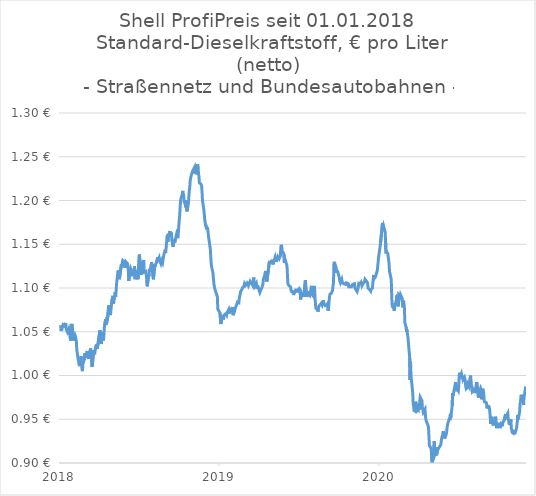
| Category | Diesel |
|---|---|
| 2020-12-12 | 0.99 |
| 2020-12-11 | 0.989 |
| 2020-12-10 | 0.991 |
| 2020-12-09 | 0.991 |
| 2020-12-08 | 0.985 |
| 2020-12-05 | 0.977 |
| 2020-12-04 | 0.978 |
| 2020-12-03 | 0.979 |
| 2020-12-02 | 0.986 |
| 2020-12-01 | 0.988 |
| 2020-11-28 | 0.978 |
| 2020-11-27 | 0.975 |
| 2020-11-26 | 0.966 |
| 2020-11-25 | 0.973 |
| 2020-11-24 | 0.971 |
| 2020-11-21 | 0.978 |
| 2020-11-20 | 0.976 |
| 2020-11-19 | 0.97 |
| 2020-11-18 | 0.968 |
| 2020-11-17 | 0.959 |
| 2020-11-14 | 0.95 |
| 2020-11-13 | 0.955 |
| 2020-11-12 | 0.949 |
| 2020-11-11 | 0.945 |
| 2020-11-10 | 0.94 |
| 2020-11-07 | 0.935 |
| 2020-11-06 | 0.935 |
| 2020-11-05 | 0.935 |
| 2020-11-04 | 0.936 |
| 2020-11-03 | 0.934 |
| 2020-10-31 | 0.935 |
| 2020-10-30 | 0.938 |
| 2020-10-29 | 0.94 |
| 2020-10-28 | 0.95 |
| 2020-10-27 | 0.944 |
| 2020-10-24 | 0.945 |
| 2020-10-23 | 0.948 |
| 2020-10-22 | 0.95 |
| 2020-10-21 | 0.957 |
| 2020-10-20 | 0.958 |
| 2020-10-17 | 0.953 |
| 2020-10-16 | 0.956 |
| 2020-10-15 | 0.955 |
| 2020-10-14 | 0.956 |
| 2020-10-13 | 0.95 |
| 2020-10-10 | 0.946 |
| 2020-10-09 | 0.946 |
| 2020-10-08 | 0.942 |
| 2020-10-07 | 0.947 |
| 2020-10-06 | 0.946 |
| 2020-10-03 | 0.94 |
| 2020-10-02 | 0.945 |
| 2020-10-01 | 0.943 |
| 2020-09-30 | 0.946 |
| 2020-09-29 | 0.945 |
| 2020-09-26 | 0.94 |
| 2020-09-25 | 0.943 |
| 2020-09-24 | 0.95 |
| 2020-09-23 | 0.953 |
| 2020-09-22 | 0.948 |
| 2020-09-19 | 0.945 |
| 2020-09-18 | 0.943 |
| 2020-09-17 | 0.943 |
| 2020-09-16 | 0.948 |
| 2020-09-15 | 0.953 |
| 2020-09-12 | 0.945 |
| 2020-09-11 | 0.953 |
| 2020-09-10 | 0.958 |
| 2020-09-09 | 0.963 |
| 2020-09-08 | 0.964 |
| 2020-09-05 | 0.965 |
| 2020-09-04 | 0.962 |
| 2020-09-03 | 0.966 |
| 2020-09-02 | 0.969 |
| 2020-09-01 | 0.969 |
| 2020-08-29 | 0.97 |
| 2020-08-28 | 0.971 |
| 2020-08-27 | 0.98 |
| 2020-08-26 | 0.982 |
| 2020-08-25 | 0.985 |
| 2020-08-22 | 0.973 |
| 2020-08-21 | 0.984 |
| 2020-08-20 | 0.985 |
| 2020-08-19 | 0.984 |
| 2020-08-18 | 0.982 |
| 2020-08-15 | 0.975 |
| 2020-08-14 | 0.98 |
| 2020-08-13 | 0.986 |
| 2020-08-12 | 0.991 |
| 2020-08-11 | 0.992 |
| 2020-08-08 | 0.981 |
| 2020-08-07 | 0.98 |
| 2020-08-06 | 0.986 |
| 2020-08-05 | 0.985 |
| 2020-08-04 | 0.983 |
| 2020-08-01 | 0.981 |
| 2020-07-31 | 0.987 |
| 2020-07-30 | 0.988 |
| 2020-07-29 | 0.994 |
| 2020-07-28 | 1 |
| 2020-07-25 | 0.987 |
| 2020-07-24 | 0.988 |
| 2020-07-23 | 0.987 |
| 2020-07-22 | 0.99 |
| 2020-07-21 | 0.987 |
| 2020-07-21 | 0.987 |
| 2020-07-18 | 0.985 |
| 2020-07-17 | 0.987 |
| 2020-07-16 | 0.993 |
| 2020-07-15 | 0.996 |
| 2020-07-14 | 0.998 |
| 2020-07-11 | 0.995 |
| 2020-07-10 | 1 |
| 2020-07-09 | 0.998 |
| 2020-07-08 | 1 |
| 2020-07-07 | 1.002 |
| 2020-07-04 | 0.999 |
| 2020-07-03 | 1.003 |
| 2020-07-02 | 0.999 |
| 2020-07-01 | 0.988 |
| 2020-06-30 | 0.982 |
| 2020-06-27 | 0.985 |
| 2020-06-26 | 0.982 |
| 2020-06-25 | 0.989 |
| 2020-06-24 | 0.992 |
| 2020-06-23 | 0.99 |
| 2020-06-20 | 0.982 |
| 2020-06-19 | 0.982 |
| 2020-06-18 | 0.976 |
| 2020-06-17 | 0.98 |
| 2020-06-16 | 0.966 |
| 2020-06-13 | 0.952 |
| 2020-06-12 | 0.956 |
| 2020-06-11 | 0.949 |
| 2020-06-10 | 0.952 |
| 2020-06-09 | 0.95 |
| 2020-06-06 | 0.945 |
| 2020-06-05 | 0.942 |
| 2020-06-04 | 0.939 |
| 2020-06-03 | 0.934 |
| 2020-05-30 | 0.928 |
| 2020-05-29 | 0.931 |
| 2020-05-28 | 0.934 |
| 2020-05-27 | 0.936 |
| 2020-05-26 | 0.934 |
| 2020-05-23 | 0.928 |
| 2020-05-21 | 0.921 |
| 2020-05-20 | 0.92 |
| 2020-05-19 | 0.92 |
| 2020-05-16 | 0.917 |
| 2020-05-15 | 0.915 |
| 2020-05-14 | 0.918 |
| 2020-05-13 | 0.917 |
| 2020-05-12 | 0.91 |
| 2020-05-09 | 0.909 |
| 2020-05-08 | 0.912 |
| 2020-05-07 | 0.917 |
| 2020-05-06 | 0.925 |
| 2020-05-05 | 0.906 |
| 2020-05-01 | 0.9 |
| 2020-04-30 | 0.91 |
| 2020-04-29 | 0.916 |
| 2020-04-28 | 0.918 |
| 2020-04-25 | 0.92 |
| 2020-04-24 | 0.93 |
| 2020-04-23 | 0.94 |
| 2020-04-22 | 0.942 |
| 2020-04-21 | 0.944 |
| 2020-04-18 | 0.948 |
| 2020-04-17 | 0.95 |
| 2020-04-16 | 0.954 |
| 2020-04-15 | 0.962 |
| 2020-04-11 | 0.958 |
| 2020-04-10 | 0.961 |
| 2020-04-09 | 0.963 |
| 2020-04-08 | 0.971 |
| 2020-04-07 | 0.972 |
| 2020-04-04 | 0.975 |
| 2020-04-03 | 0.971 |
| 2020-04-02 | 0.961 |
| 2020-04-01 | 0.968 |
| 2020-03-31 | 0.962 |
| 2020-03-28 | 0.965 |
| 2020-03-27 | 0.958 |
| 2020-03-26 | 0.963 |
| 2020-03-25 | 0.97 |
| 2020-03-24 | 0.959 |
| 2020-03-21 | 0.96 |
| 2020-03-20 | 0.965 |
| 2020-03-19 | 0.968 |
| 2020-03-18 | 0.98 |
| 2020-03-17 | 0.985 |
| 2020-03-14 | 1 |
| 2020-03-13 | 1.016 |
| 2020-03-12 | 0.995 |
| 2020-03-11 | 1.02 |
| 2020-03-10 | 1.02 |
| 2020-03-07 | 1.044 |
| 2020-03-06 | 1.046 |
| 2020-03-05 | 1.052 |
| 2020-03-04 | 1.05 |
| 2020-03-03 | 1.055 |
| 2020-02-29 | 1.06 |
| 2020-02-28 | 1.077 |
| 2020-02-27 | 1.082 |
| 2020-02-26 | 1.086 |
| 2020-02-25 | 1.078 |
| 2020-02-22 | 1.089 |
| 2020-02-21 | 1.09 |
| 2020-02-20 | 1.09 |
| 2020-02-19 | 1.092 |
| 2020-02-18 | 1.09 |
| 2020-02-15 | 1.092 |
| 2020-02-14 | 1.079 |
| 2020-02-13 | 1.092 |
| 2020-02-12 | 1.09 |
| 2020-02-11 | 1.092 |
| 2020-02-08 | 1.08 |
| 2020-02-07 | 1.083 |
| 2020-02-06 | 1.08 |
| 2020-02-05 | 1.074 |
| 2020-02-04 | 1.077 |
| 2020-02-01 | 1.078 |
| 2020-01-31 | 1.08 |
| 2020-01-30 | 1.09 |
| 2020-01-29 | 1.109 |
| 2020-01-28 | 1.112 |
| 2020-01-25 | 1.119 |
| 2020-01-24 | 1.127 |
| 2020-01-23 | 1.132 |
| 2020-01-22 | 1.136 |
| 2020-01-21 | 1.14 |
| 2020-01-18 | 1.141 |
| 2020-01-17 | 1.14 |
| 2020-01-16 | 1.153 |
| 2020-01-15 | 1.164 |
| 2020-01-14 | 1.162 |
| 2020-01-11 | 1.172 |
| 2020-01-10 | 1.17 |
| 2020-01-09 | 1.174 |
| 2020-01-08 | 1.175 |
| 2020-01-04 | 1.149 |
| 2020-01-03 | 1.15 |
| 2019-12-31 | 1.135 |
| 2019-12-28 | 1.12 |
| 2019-12-24 | 1.113 |
| 2019-12-21 | 1.111 |
| 2019-12-20 | 1.115 |
| 2019-12-19 | 1.11 |
| 2019-12-18 | 1.106 |
| 2019-12-17 | 1.1 |
| 2019-12-14 | 1.098 |
| 2019-12-13 | 1.096 |
| 2019-12-12 | 1.096 |
| 2019-12-11 | 1.098 |
| 2019-12-10 | 1.098 |
| 2019-12-07 | 1.1 |
| 2019-12-06 | 1.105 |
| 2019-12-05 | 1.105 |
| 2019-12-04 | 1.107 |
| 2019-12-03 | 1.108 |
| 2019-11-30 | 1.11 |
| 2019-11-29 | 1.107 |
| 2019-11-28 | 1.107 |
| 2019-11-27 | 1.107 |
| 2019-11-26 | 1.105 |
| 2019-11-23 | 1.102 |
| 2019-11-22 | 1.102 |
| 2019-11-21 | 1.106 |
| 2019-11-20 | 1.106 |
| 2019-11-19 | 1.105 |
| 2019-11-16 | 1.105 |
| 2019-11-15 | 1.106 |
| 2019-11-14 | 1.099 |
| 2019-11-13 | 1.1 |
| 2019-11-12 | 1.096 |
| 2019-11-09 | 1.098 |
| 2019-11-08 | 1.099 |
| 2019-11-07 | 1.1 |
| 2019-11-06 | 1.105 |
| 2019-11-05 | 1.105 |
| 2019-11-01 | 1.104 |
| 2019-10-31 | 1.105 |
| 2019-10-30 | 1.101 |
| 2019-10-29 | 1.102 |
| 2019-10-26 | 1.101 |
| 2019-10-25 | 1.1 |
| 2019-10-24 | 1.099 |
| 2019-10-23 | 1.105 |
| 2019-10-22 | 1.104 |
| 2019-10-19 | 1.106 |
| 2019-10-18 | 1.103 |
| 2019-10-17 | 1.105 |
| 2019-10-16 | 1.104 |
| 2019-10-15 | 1.104 |
| 2019-10-12 | 1.105 |
| 2019-10-11 | 1.104 |
| 2019-10-10 | 1.105 |
| 2019-10-09 | 1.107 |
| 2019-10-08 | 1.11 |
| 2019-10-05 | 1.106 |
| 2019-10-03 | 1.109 |
| 2019-10-02 | 1.113 |
| 2019-10-01 | 1.114 |
| 2019-09-28 | 1.12 |
| 2019-09-27 | 1.117 |
| 2019-09-26 | 1.12 |
| 2019-09-25 | 1.123 |
| 2019-09-24 | 1.125 |
| 2019-09-21 | 1.13 |
| 2019-09-20 | 1.124 |
| 2019-09-19 | 1.106 |
| 2019-09-18 | 1.103 |
| 2019-09-17 | 1.097 |
| 2019-09-14 | 1.094 |
| 2019-09-13 | 1.093 |
| 2019-09-12 | 1.093 |
| 2019-09-11 | 1.093 |
| 2019-09-10 | 1.09 |
| 2019-09-07 | 1.074 |
| 2019-09-06 | 1.082 |
| 2019-09-05 | 1.082 |
| 2019-09-04 | 1.081 |
| 2019-09-03 | 1.082 |
| 2019-08-31 | 1.08 |
| 2019-08-30 | 1.081 |
| 2019-08-29 | 1.081 |
| 2019-08-28 | 1.081 |
| 2019-08-27 | 1.086 |
| 2019-08-24 | 1.08 |
| 2019-08-23 | 1.08 |
| 2019-08-22 | 1.082 |
| 2019-08-21 | 1.082 |
| 2019-08-20 | 1.083 |
| 2019-08-17 | 1.079 |
| 2019-08-16 | 1.078 |
| 2019-08-15 | 1.073 |
| 2019-08-14 | 1.077 |
| 2019-08-13 | 1.076 |
| 2019-08-10 | 1.077 |
| 2019-08-09 | 1.081 |
| 2019-08-08 | 1.088 |
| 2019-08-07 | 1.099 |
| 2019-08-06 | 1.102 |
| 2019-08-03 | 1.091 |
| 2019-08-02 | 1.091 |
| 2019-08-01 | 1.093 |
| 2019-07-31 | 1.102 |
| 2019-07-30 | 1.1 |
| 2019-07-27 | 1.091 |
| 2019-07-26 | 1.092 |
| 2019-07-25 | 1.092 |
| 2019-07-24 | 1.093 |
| 2019-07-23 | 1.096 |
| 2019-07-20 | 1.09 |
| 2019-07-19 | 1.097 |
| 2019-07-18 | 1.102 |
| 2019-07-17 | 1.109 |
| 2019-07-16 | 1.108 |
| 2019-07-13 | 1.09 |
| 2019-07-12 | 1.094 |
| 2019-07-11 | 1.093 |
| 2019-07-10 | 1.093 |
| 2019-07-09 | 1.092 |
| 2019-07-06 | 1.087 |
| 2019-07-05 | 1.098 |
| 2019-07-04 | 1.097 |
| 2019-07-03 | 1.099 |
| 2019-07-02 | 1.1 |
| 2019-06-29 | 1.097 |
| 2019-06-28 | 1.095 |
| 2019-06-27 | 1.096 |
| 2019-06-26 | 1.099 |
| 2019-06-25 | 1.097 |
| 2019-06-22 | 1.094 |
| 2019-06-20 | 1.092 |
| 2019-06-19 | 1.097 |
| 2019-06-18 | 1.095 |
| 2019-06-15 | 1.096 |
| 2019-06-14 | 1.098 |
| 2019-06-13 | 1.101 |
| 2019-06-12 | 1.102 |
| 2019-06-08 | 1.104 |
| 2019-06-07 | 1.105 |
| 2019-06-06 | 1.115 |
| 2019-06-05 | 1.125 |
| 2019-06-04 | 1.127 |
| 2019-06-01 | 1.132 |
| 2019-05-30 | 1.129 |
| 2019-05-29 | 1.138 |
| 2019-05-28 | 1.14 |
| 2019-05-25 | 1.141 |
| 2019-05-24 | 1.148 |
| 2019-05-23 | 1.149 |
| 2019-05-22 | 1.15 |
| 2019-05-21 | 1.137 |
| 2019-05-18 | 1.133 |
| 2019-05-17 | 1.134 |
| 2019-05-16 | 1.134 |
| 2019-05-15 | 1.136 |
| 2019-05-14 | 1.134 |
| 2019-05-11 | 1.13 |
| 2019-05-10 | 1.133 |
| 2019-05-09 | 1.135 |
| 2019-05-08 | 1.135 |
| 2019-05-07 | 1.132 |
| 2019-05-04 | 1.127 |
| 2019-05-03 | 1.129 |
| 2019-05-01 | 1.131 |
| 2019-04-30 | 1.132 |
| 2019-04-27 | 1.129 |
| 2019-04-26 | 1.131 |
| 2019-04-25 | 1.13 |
| 2019-04-24 | 1.13 |
| 2019-04-20 | 1.107 |
| 2019-04-19 | 1.11 |
| 2019-04-18 | 1.115 |
| 2019-04-17 | 1.119 |
| 2019-04-16 | 1.116 |
| 2019-04-13 | 1.111 |
| 2019-04-12 | 1.11 |
| 2019-04-11 | 1.104 |
| 2019-04-10 | 1.103 |
| 2019-04-09 | 1.101 |
| 2019-04-06 | 1.097 |
| 2019-04-05 | 1.098 |
| 2019-04-04 | 1.095 |
| 2019-04-03 | 1.094 |
| 2019-04-02 | 1.094 |
| 2019-03-30 | 1.103 |
| 2019-03-29 | 1.099 |
| 2019-03-28 | 1.1 |
| 2019-03-27 | 1.105 |
| 2019-03-26 | 1.105 |
| 2019-03-23 | 1.102 |
| 2019-03-22 | 1.104 |
| 2019-03-21 | 1.112 |
| 2019-03-20 | 1.105 |
| 2019-03-19 | 1.103 |
| 2019-03-16 | 1.106 |
| 2019-03-15 | 1.105 |
| 2019-03-14 | 1.105 |
| 2019-03-13 | 1.108 |
| 2019-03-12 | 1.108 |
| 2019-03-09 | 1.103 |
| 2019-03-08 | 1.104 |
| 2019-03-07 | 1.104 |
| 2019-03-06 | 1.106 |
| 2019-03-05 | 1.107 |
| 2019-03-02 | 1.103 |
| 2019-03-01 | 1.102 |
| 2019-02-28 | 1.105 |
| 2019-02-27 | 1.102 |
| 2019-02-26 | 1.103 |
| 2019-02-23 | 1.1 |
| 2019-02-22 | 1.098 |
| 2019-02-21 | 1.099 |
| 2019-02-20 | 1.099 |
| 2019-02-19 | 1.096 |
| 2019-02-16 | 1.088 |
| 2019-02-15 | 1.083 |
| 2019-02-14 | 1.084 |
| 2019-02-13 | 1.083 |
| 2019-02-12 | 1.084 |
| 2019-02-09 | 1.08 |
| 2019-02-08 | 1.08 |
| 2019-02-07 | 1.079 |
| 2019-02-06 | 1.076 |
| 2019-02-05 | 1.073 |
| 2019-02-02 | 1.069 |
| 2019-02-01 | 1.075 |
| 2019-01-31 | 1.078 |
| 2019-01-30 | 1.077 |
| 2019-01-29 | 1.074 |
| 2019-01-26 | 1.075 |
| 2019-01-25 | 1.071 |
| 2019-01-24 | 1.071 |
| 2019-01-23 | 1.076 |
| 2019-01-22 | 1.075 |
| 2019-01-19 | 1.072 |
| 2019-01-18 | 1.069 |
| 2019-01-17 | 1.07 |
| 2019-01-16 | 1.071 |
| 2019-01-15 | 1.071 |
| 2019-01-12 | 1.069 |
| 2019-01-11 | 1.064 |
| 2019-01-10 | 1.066 |
| 2019-01-09 | 1.065 |
| 2019-01-08 | 1.069 |
| 2019-01-05 | 1.059 |
| 2019-01-04 | 1.06 |
| 2019-01-03 | 1.071 |
| 2018-12-29 | 1.076 |
| 2018-12-28 | 1.09 |
| 2018-12-22 | 1.099 |
| 2018-12-21 | 1.102 |
| 2018-12-20 | 1.105 |
| 2018-12-18 | 1.117 |
| 2018-12-15 | 1.124 |
| 2018-12-14 | 1.128 |
| 2018-12-13 | 1.135 |
| 2018-12-12 | 1.144 |
| 2018-12-11 | 1.145 |
| 2018-12-08 | 1.158 |
| 2018-12-07 | 1.163 |
| 2018-12-06 | 1.168 |
| 2018-12-05 | 1.17 |
| 2018-12-04 | 1.167 |
| 2018-12-01 | 1.173 |
| 2018-11-30 | 1.175 |
| 2018-11-29 | 1.179 |
| 2018-11-28 | 1.185 |
| 2018-11-27 | 1.19 |
| 2018-11-24 | 1.2 |
| 2018-11-23 | 1.21 |
| 2018-11-22 | 1.217 |
| 2018-11-21 | 1.218 |
| 2018-11-20 | 1.219 |
| 2018-11-17 | 1.22 |
| 2018-11-16 | 1.228 |
| 2018-11-15 | 1.23 |
| 2018-11-14 | 1.239 |
| 2018-11-13 | 1.241 |
| 2018-11-10 | 1.23 |
| 2018-11-09 | 1.237 |
| 2018-11-08 | 1.235 |
| 2018-11-07 | 1.231 |
| 2018-11-06 | 1.238 |
| 2018-11-03 | 1.235 |
| 2018-11-01 | 1.233 |
| 2018-10-31 | 1.233 |
| 2018-10-30 | 1.23 |
| 2018-10-27 | 1.223 |
| 2018-10-26 | 1.215 |
| 2018-10-25 | 1.212 |
| 2018-10-24 | 1.205 |
| 2018-10-23 | 1.198 |
| 2018-10-20 | 1.188 |
| 2018-10-19 | 1.191 |
| 2018-10-18 | 1.2 |
| 2018-10-17 | 1.192 |
| 2018-10-16 | 1.195 |
| 2018-10-13 | 1.199 |
| 2018-10-12 | 1.206 |
| 2018-10-11 | 1.208 |
| 2018-10-10 | 1.211 |
| 2018-10-09 | 1.207 |
| 2018-10-06 | 1.202 |
| 2018-10-05 | 1.2 |
| 2018-10-03 | 1.184 |
| 2018-10-02 | 1.178 |
| 2018-09-29 | 1.157 |
| 2018-09-28 | 1.159 |
| 2018-09-27 | 1.16 |
| 2018-09-26 | 1.162 |
| 2018-09-25 | 1.16 |
| 2018-09-22 | 1.152 |
| 2018-09-21 | 1.155 |
| 2018-09-20 | 1.153 |
| 2018-09-19 | 1.15 |
| 2018-09-18 | 1.147 |
| 2018-09-15 | 1.156 |
| 2018-09-14 | 1.164 |
| 2018-09-13 | 1.162 |
| 2018-09-12 | 1.16 |
| 2018-09-11 | 1.165 |
| 2018-09-08 | 1.158 |
| 2018-09-07 | 1.162 |
| 2018-09-06 | 1.153 |
| 2018-09-05 | 1.16 |
| 2018-09-04 | 1.157 |
| 2018-09-01 | 1.14 |
| 2018-08-31 | 1.144 |
| 2018-08-30 | 1.142 |
| 2018-08-29 | 1.14 |
| 2018-08-28 | 1.138 |
| 2018-08-25 | 1.129 |
| 2018-08-23 | 1.132 |
| 2018-08-22 | 1.13 |
| 2018-08-21 | 1.128 |
| 2018-08-18 | 1.132 |
| 2018-08-17 | 1.135 |
| 2018-08-15 | 1.133 |
| 2018-08-14 | 1.135 |
| 2018-08-11 | 1.129 |
| 2018-08-10 | 1.128 |
| 2018-08-09 | 1.127 |
| 2018-08-08 | 1.124 |
| 2018-08-07 | 1.127 |
| 2018-08-04 | 1.11 |
| 2018-08-03 | 1.109 |
| 2018-08-02 | 1.119 |
| 2018-08-01 | 1.125 |
| 2018-07-31 | 1.13 |
| 2018-07-28 | 1.119 |
| 2018-07-27 | 1.122 |
| 2018-07-26 | 1.12 |
| 2018-07-25 | 1.113 |
| 2018-07-24 | 1.115 |
| 2018-07-21 | 1.102 |
| 2018-07-20 | 1.108 |
| 2018-07-19 | 1.114 |
| 2018-07-18 | 1.119 |
| 2018-07-17 | 1.12 |
| 2018-07-14 | 1.118 |
| 2018-07-13 | 1.132 |
| 2018-07-12 | 1.128 |
| 2018-07-11 | 1.13 |
| 2018-07-10 | 1.126 |
| 2018-07-07 | 1.115 |
| 2018-07-06 | 1.127 |
| 2018-07-05 | 1.13 |
| 2018-07-04 | 1.134 |
| 2018-07-03 | 1.138 |
| 2018-06-30 | 1.11 |
| 2018-06-29 | 1.112 |
| 2018-06-28 | 1.12 |
| 2018-06-27 | 1.118 |
| 2018-06-26 | 1.115 |
| 2018-06-23 | 1.11 |
| 2018-06-22 | 1.125 |
| 2018-06-21 | 1.12 |
| 2018-06-20 | 1.116 |
| 2018-06-19 | 1.117 |
| 2018-06-16 | 1.114 |
| 2018-06-15 | 1.12 |
| 2018-06-14 | 1.121 |
| 2018-06-13 | 1.122 |
| 2018-06-12 | 1.12 |
| 2018-06-09 | 1.108 |
| 2018-06-08 | 1.118 |
| 2018-06-07 | 1.123 |
| 2018-06-06 | 1.128 |
| 2018-06-05 | 1.128 |
| 2018-06-02 | 1.13 |
| 2018-05-31 | 1.123 |
| 2018-05-30 | 1.128 |
| 2018-05-29 | 1.13 |
| 2018-05-26 | 1.132 |
| 2018-05-25 | 1.13 |
| 2018-05-24 | 1.125 |
| 2018-05-23 | 1.127 |
| 2018-05-19 | 1.112 |
| 2018-05-18 | 1.11 |
| 2018-05-17 | 1.118 |
| 2018-05-16 | 1.12 |
| 2018-05-15 | 1.118 |
| 2018-05-12 | 1.106 |
| 2018-05-10 | 1.09 |
| 2018-05-09 | 1.095 |
| 2018-05-08 | 1.092 |
| 2018-05-05 | 1.082 |
| 2018-05-04 | 1.091 |
| 2018-05-03 | 1.092 |
| 2018-05-01 | 1.085 |
| 2018-04-28 | 1.069 |
| 2018-04-27 | 1.078 |
| 2018-04-26 | 1.08 |
| 2018-04-25 | 1.075 |
| 2018-04-24 | 1.08 |
| 2018-04-21 | 1.063 |
| 2018-04-20 | 1.066 |
| 2018-04-19 | 1.058 |
| 2018-04-18 | 1.063 |
| 2018-04-17 | 1.064 |
| 2018-04-14 | 1.055 |
| 2018-04-13 | 1.046 |
| 2018-04-12 | 1.04 |
| 2018-04-11 | 1.048 |
| 2018-04-10 | 1.05 |
| 2018-04-07 | 1.036 |
| 2018-04-06 | 1.046 |
| 2018-04-05 | 1.044 |
| 2018-04-04 | 1.052 |
| 2018-03-30 | 1.034 |
| 2018-03-29 | 1.03 |
| 2018-03-28 | 1.032 |
| 2018-03-27 | 1.035 |
| 2018-03-24 | 1.029 |
| 2018-03-23 | 1.024 |
| 2018-03-22 | 1.025 |
| 2018-03-21 | 1.029 |
| 2018-03-20 | 1.03 |
| 2018-03-17 | 1.01 |
| 2018-03-16 | 1.02 |
| 2018-03-15 | 1.022 |
| 2018-03-14 | 1.031 |
| 2018-03-13 | 1.03 |
| 2018-03-10 | 1.023 |
| 2018-03-09 | 1.019 |
| 2018-03-08 | 1.02 |
| 2018-03-07 | 1.025 |
| 2018-03-06 | 1.028 |
| 2018-03-03 | 1.02 |
| 2018-03-02 | 1.025 |
| 2018-03-01 | 1.022 |
| 2018-02-28 | 1.025 |
| 2018-02-27 | 1.018 |
| 2018-02-24 | 1.013 |
| 2018-02-23 | 1.005 |
| 2018-02-22 | 1.01 |
| 2018-02-21 | 1.012 |
| 2018-02-20 | 1.022 |
| 2018-02-17 | 1.011 |
| 2018-02-16 | 1.01 |
| 2018-02-15 | 1.014 |
| 2018-02-14 | 1.014 |
| 2018-02-13 | 1.019 |
| 2018-02-10 | 1.03 |
| 2018-02-09 | 1.04 |
| 2018-02-08 | 1.042 |
| 2018-02-07 | 1.045 |
| 2018-02-06 | 1.046 |
| 2018-02-02 | 1.04 |
| 2018-02-01 | 1.048 |
| 2018-01-31 | 1.055 |
| 2018-01-30 | 1.059 |
| 2018-01-27 | 1.04 |
| 2018-01-26 | 1.044 |
| 2018-01-25 | 1.045 |
| 2018-01-24 | 1.052 |
| 2018-01-23 | 1.054 |
| 2018-01-20 | 1.05 |
| 2018-01-19 | 1.05 |
| 2018-01-18 | 1.052 |
| 2018-01-17 | 1.053 |
| 2018-01-16 | 1.06 |
| 2018-01-13 | 1.055 |
| 2018-01-12 | 1.056 |
| 2018-01-11 | 1.06 |
| 2018-01-10 | 1.058 |
| 2018-01-09 | 1.057 |
| 2018-01-06 | 1.051 |
| 2018-01-05 | 1.053 |
| 2018-01-04 | 1.058 |
| 2018-01-03 | 1.057 |